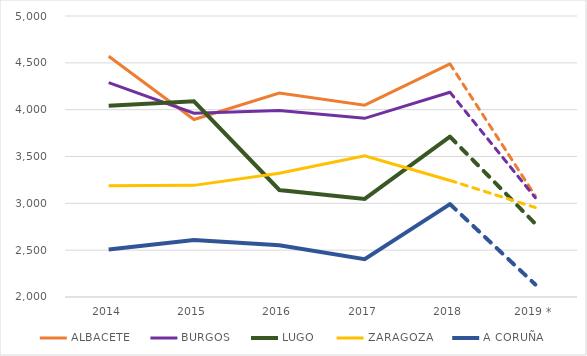
| Category | ALBACETE | BURGOS | LUGO | ZARAGOZA | A CORUÑA |
|---|---|---|---|---|---|
| 2014 | 4570.29 | 4287.93 | 4041.32 | 3187.48 | 2506.39 |
| 2015 | 3894.9 | 3962.1 | 4089.21 | 3191.85 | 2608.94 |
| 2016 | 4176.59 | 3990.87 | 3142.7 | 3320.27 | 2552.16 |
| 2017 | 4048.6 | 3907.65 | 3047.2 | 3507.43 | 2402.78 |
| 2018 | 4488.05 | 4185.9 | 3711.56 | 3244.36 | 2991.48 |
| 2019 * | 3078.499 | 3059.451 | 2781.494 | 2955.52 | 2133.087 |